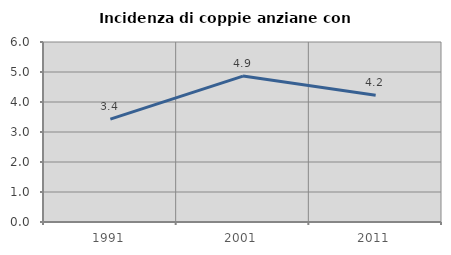
| Category | Incidenza di coppie anziane con figli |
|---|---|
| 1991.0 | 3.431 |
| 2001.0 | 4.865 |
| 2011.0 | 4.225 |